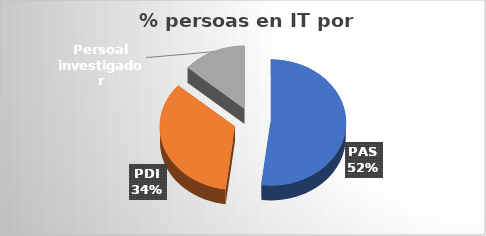
| Category | Series 0 |
|---|---|
| PAS | 342 |
| PDI | 226 |
| Persoal investigador | 90 |